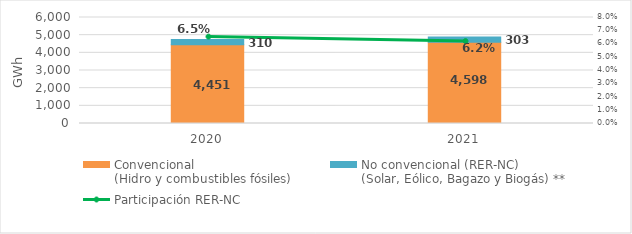
| Category | Convencional
(Hidro y combustibles fósiles) | No convencional (RER-NC)
(Solar, Eólico, Bagazo y Biogás) ** |
|---|---|---|
| 2020.0 | 4451.368 | 310.418 |
| 2021.0 | 4598.477 | 303.01 |